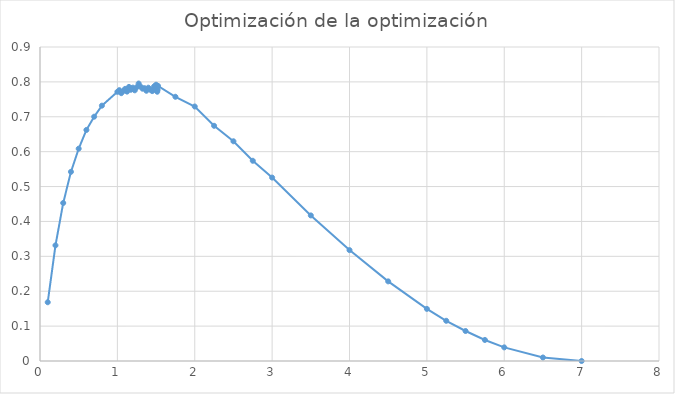
| Category | blabla |
|---|---|
| 0.1 | 0.168 |
| 0.2 | 0.331 |
| 0.3 | 0.453 |
| 0.4 | 0.542 |
| 0.5 | 0.609 |
| 0.6 | 0.662 |
| 0.7 | 0.7 |
| 0.8 | 0.732 |
| 1.0 | 0.771 |
| 1.025 | 0.776 |
| 1.05 | 0.768 |
| 1.075 | 0.774 |
| 1.1 | 0.78 |
| 1.125 | 0.772 |
| 1.15 | 0.786 |
| 1.175 | 0.777 |
| 1.2 | 0.784 |
| 1.225 | 0.776 |
| 1.25 | 0.785 |
| 1.275 | 0.795 |
| 1.3 | 0.787 |
| 1.325 | 0.781 |
| 1.35 | 0.782 |
| 1.375 | 0.775 |
| 1.4 | 0.783 |
| 1.425 | 0.778 |
| 1.45 | 0.774 |
| 1.465 | 0.778 |
| 1.475 | 0.787 |
| 1.48 | 0.786 |
| 1.485 | 0.779 |
| 1.495 | 0.779 |
| 1.5 | 0.792 |
| 1.505 | 0.785 |
| 1.51 | 0.782 |
| 1.515 | 0.772 |
| 1.52 | 0.777 |
| 1.525 | 0.789 |
| 1.75 | 0.757 |
| 2.0 | 0.729 |
| 2.25 | 0.674 |
| 2.5 | 0.63 |
| 2.75 | 0.574 |
| 3.0 | 0.526 |
| 3.5 | 0.417 |
| 4.0 | 0.318 |
| 4.5 | 0.228 |
| 5.0 | 0.149 |
| 5.25 | 0.115 |
| 5.5 | 0.086 |
| 5.75 | 0.06 |
| 6.0 | 0.039 |
| 6.5 | 0.01 |
| 7.0 | 0 |